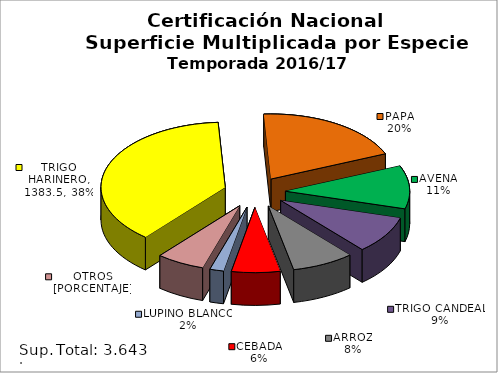
| Category | Series 0 |
|---|---|
| TRIGO HARINERO | 1383.5 |
| PAPA | 712.504 |
| AVENA | 391.14 |
| TRIGO CANDEAL | 336.6 |
| ARROZ | 295.536 |
| CEBADA | 229.9 |
| LUPINO BLANCO | 65.5 |
| OTROS (trébol rosado, triticale, lupino amarillo, lino) | 228.8 |